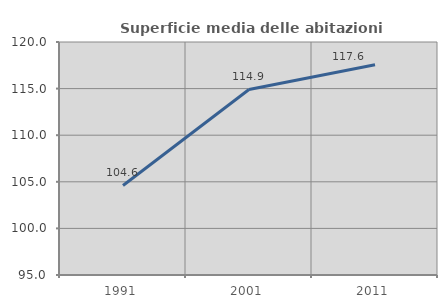
| Category | Superficie media delle abitazioni occupate |
|---|---|
| 1991.0 | 104.61 |
| 2001.0 | 114.906 |
| 2011.0 | 117.552 |